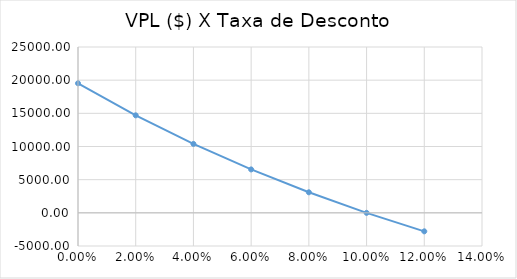
| Category | VPLX ($) |
|---|---|
| 0.0 | 19530 |
| 0.02 | 14697.12 |
| 0.04 | 10391.3 |
| 0.06 | 6543.94 |
| 0.08 | 3096.66 |
| 0.1 | -0.47 |
| 0.12 | -2790.22 |